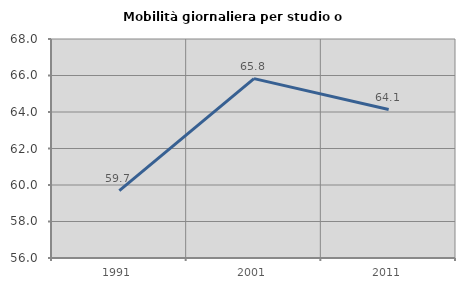
| Category | Mobilità giornaliera per studio o lavoro |
|---|---|
| 1991.0 | 59.691 |
| 2001.0 | 65.831 |
| 2011.0 | 64.133 |